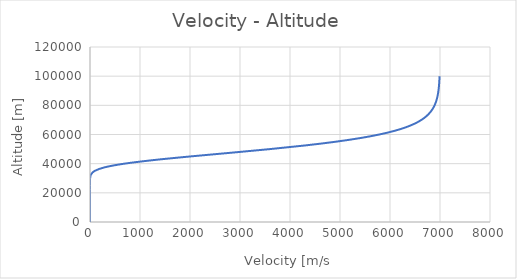
| Category | Altitude - Velocity |
|---|---|
| 6991.023142563853 | 100000 |
| 6987.732977548767 | 97500 |
| 6983.238359697309 | 95000 |
| 6977.099621445201 | 92500 |
| 6968.717689000621 | 90000 |
| 6957.277231366109 | 87500 |
| 6941.670353825998 | 85000 |
| 6920.3948961467695 | 82500 |
| 6891.420228791473 | 80000 |
| 6852.012681866636 | 77500 |
| 6798.513203243099 | 75000 |
| 6726.063113026618 | 72500 |
| 6628.282827138094 | 70000 |
| 6496.928234065491 | 67500 |
| 6321.588167245895 | 65000 |
| 6089.55571875321 | 62500 |
| 5786.118886766465 | 60000 |
| 5395.676886647001 | 57500 |
| 4904.267302851271 | 55000 |
| 4304.164895444477 | 52500 |
| 3600.886025667824 | 50000 |
| 2821.6777918563466 | 47500 |
| 2021.8857406457043 | 45000 |
| 1282.0522034069172 | 42500 |
| 687.8212556098988 | 40000 |
| 293.65773756972254 | 37500 |
| 91.7511414810889 | 35000 |
| 18.708715923095987 | 32500 |
| 2.1288748284094 | 30000 |
| 0.10914408272733887 | 27500 |
| 0.0018818037035642611 | 25000 |
| 7.315717466609564e-06 | 22500 |
| 3.713159970190176e-09 | 20000 |
| 1.1659446444074274e-13 | 17500 |
| 8.160501393649407e-20 | 15000 |
| 3.1541511472507742e-28 | 12500 |
| 9.99772827387566e-40 | 10000 |
| 1.917156552815439e-55 | 7500 |
| 6.305688156933961e-77 | 5000 |
| 2.729325859875643e-106 | 2500 |
| 1.9983310596918817e-146 | 0 |